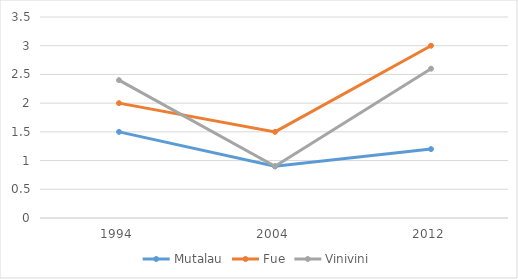
| Category | Mutalau | Fue | Vinivini |
|---|---|---|---|
| 1994.0 | 1.5 | 2 | 2.4 |
| 2004.0 | 0.9 | 1.5 | 0.9 |
| 2012.0 | 1.2 | 3 | 2.6 |